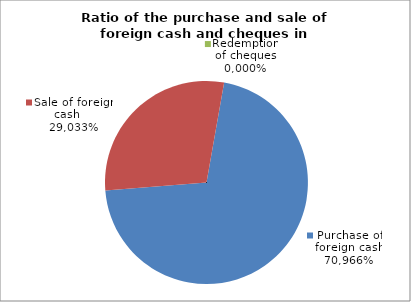
| Category | Purchase of foreign cash |
|---|---|
| 0 | 0.71 |
| 1 | 0.29 |
| 2 | 0 |